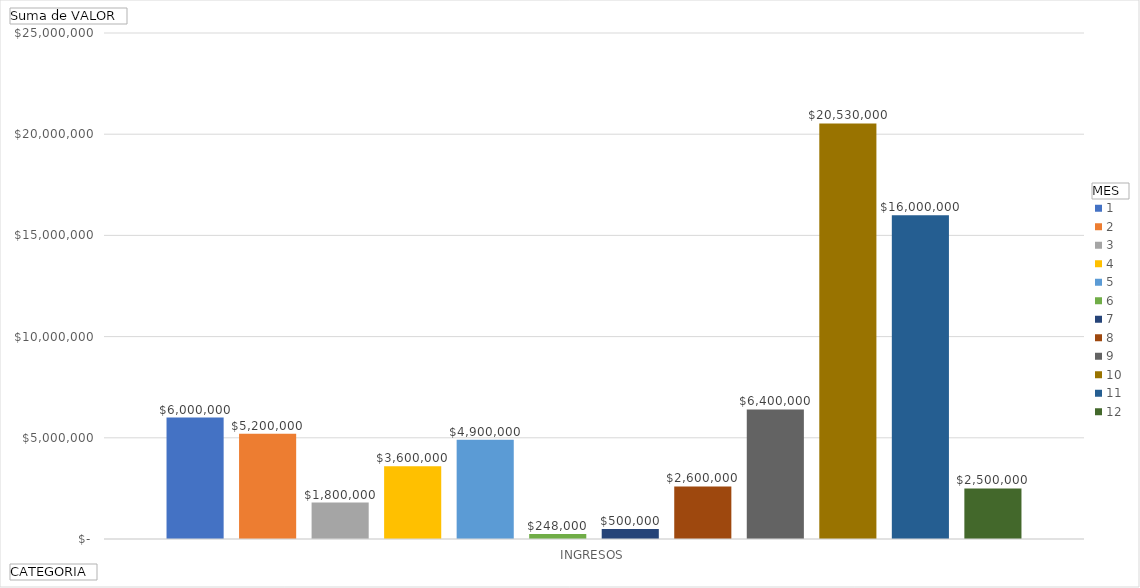
| Category | 1 | 2 | 3 | 4 | 5 | 6 | 7 | 8 | 9 | 10 | 11 | 12 |
|---|---|---|---|---|---|---|---|---|---|---|---|---|
| INGRESOS | 6000000 | 5200000 | 1800000 | 3600000 | 4900000 | 248000 | 500000 | 2600000 | 6400000 | 20530000 | 16000000 | 2500000 |